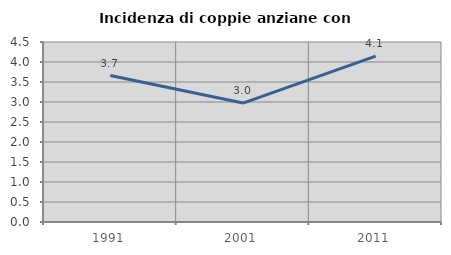
| Category | Incidenza di coppie anziane con figli |
|---|---|
| 1991.0 | 3.662 |
| 2001.0 | 2.973 |
| 2011.0 | 4.148 |